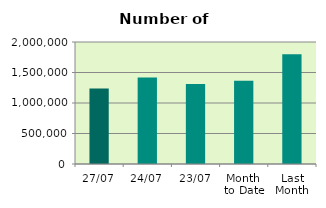
| Category | Series 0 |
|---|---|
| 27/07 | 1237348 |
| 24/07 | 1417178 |
| 23/07 | 1310672 |
| Month 
to Date | 1365224.947 |
| Last
Month | 1799892.818 |